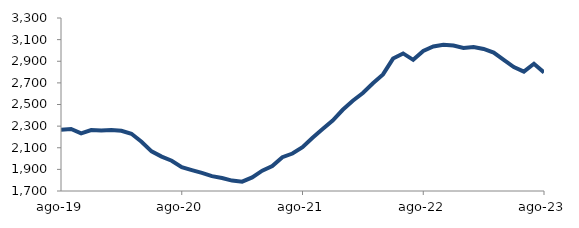
| Category | Series 0 |
|---|---|
| 2019-08-01 | 2267.321 |
| 2019-09-01 | 2273.768 |
| 2019-10-01 | 2233.304 |
| 2019-11-01 | 2263.898 |
| 2019-12-01 | 2259.926 |
| 2020-01-01 | 2265.053 |
| 2020-02-01 | 2256.766 |
| 2020-03-01 | 2229.161 |
| 2020-04-01 | 2155.791 |
| 2020-05-01 | 2066.843 |
| 2020-06-01 | 2018.026 |
| 2020-07-01 | 1979.558 |
| 2020-08-01 | 1920.368 |
| 2020-09-01 | 1893.237 |
| 2020-10-01 | 1867.4 |
| 2020-11-01 | 1837.195 |
| 2020-12-01 | 1819.546 |
| 2021-01-01 | 1796.45 |
| 2021-02-01 | 1786.603 |
| 2021-03-01 | 1826.072 |
| 2021-04-01 | 1887.798 |
| 2021-05-01 | 1930.372 |
| 2021-06-01 | 2012.926 |
| 2021-07-01 | 2046.434 |
| 2021-08-01 | 2105.806 |
| 2021-09-01 | 2192.514 |
| 2021-10-01 | 2272.972 |
| 2021-11-01 | 2351.334 |
| 2021-12-01 | 2451.171 |
| 2022-01-01 | 2534.613 |
| 2022-02-01 | 2606.357 |
| 2022-03-01 | 2696.948 |
| 2022-04-01 | 2778.264 |
| 2022-05-01 | 2924.682 |
| 2022-06-01 | 2972.281 |
| 2022-07-01 | 2912.933 |
| 2022-08-01 | 2994.913 |
| 2022-09-01 | 3036.467 |
| 2022-10-01 | 3052.236 |
| 2022-11-01 | 3044.767 |
| 2022-12-01 | 3023.141 |
| 2023-01-01 | 3030.956 |
| 2023-02-01 | 3013.674 |
| 2023-03-01 | 2979.861 |
| 2023-04-01 | 2913.014 |
| 2023-05-01 | 2845.832 |
| 2023-06-01 | 2803.594 |
| 2023-07-01 | 2876.7 |
| 2023-08-01 | 2796.297 |